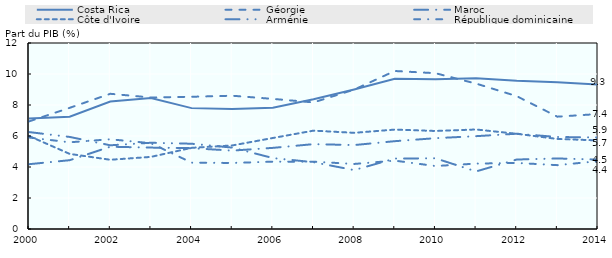
| Category | Costa Rica | Géorgie | Maroc | Côte d'Ivoire | Arménie | République dominicaine |
|---|---|---|---|---|---|---|
| 2000 | 7.124 | 6.939 | 4.181 | 6.001 | 6.253 | 5.902 |
| 2001 | 7.247 | 7.816 | 4.439 | 4.846 | 5.94 | 5.594 |
| 2002 | 8.226 | 8.723 | 5.308 | 4.467 | 5.4 | 5.789 |
| 2003 | 8.449 | 8.485 | 5.252 | 4.652 | 5.564 | 5.534 |
| 2004 | 7.798 | 8.531 | 5.216 | 5.237 | 5.501 | 4.281 |
| 2005 | 7.74 | 8.599 | 5.058 | 5.39 | 5.252 | 4.262 |
| 2006 | 7.823 | 8.394 | 5.234 | 5.871 | 4.578 | 4.344 |
| 2007 | 8.37 | 8.167 | 5.475 | 6.346 | 4.309 | 4.344 |
| 2008 | 9.005 | 8.993 | 5.415 | 6.206 | 3.799 | 4.196 |
| 2009 | 9.687 | 10.194 | 5.666 | 6.414 | 4.545 | 4.411 |
| 2010 | 9.657 | 10.052 | 5.859 | 6.324 | 4.562 | 4.062 |
| 2011 | 9.729 | 9.382 | 5.989 | 6.421 | 3.714 | 4.219 |
| 2012 | 9.56 | 8.571 | 6.147 | 6.143 | 4.482 | 4.264 |
| 2013 | 9.467 | 7.247 | 5.935 | 5.81 | 4.55 | 4.119 |
| 2014 | 9.313 | 7.417 | 5.908 | 5.716 | 4.48 | 4.376 |